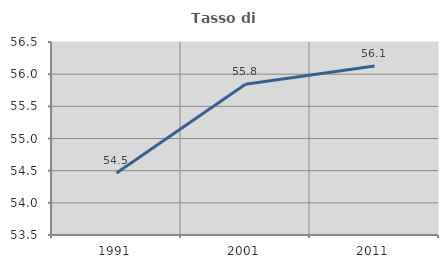
| Category | Tasso di occupazione   |
|---|---|
| 1991.0 | 54.462 |
| 2001.0 | 55.842 |
| 2011.0 | 56.128 |